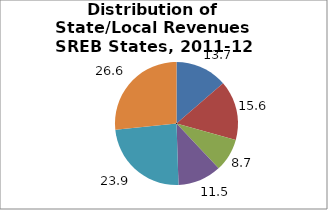
| Category | Series 0 |
|---|---|
| General Sales | 13.673 |
| Property | 15.614 |
| Income1 | 8.706 |
| Other | 11.453 |
| From Federal Government | 23.913 |
| Nontax Revenues2 | 26.582 |